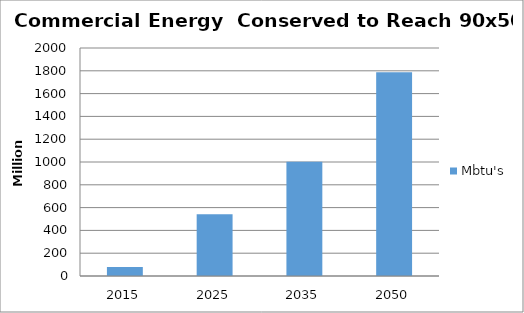
| Category | Mbtu's |
|---|---|
| 2015.0 | 78.353 |
| 2025.0 | 540.639 |
| 2035.0 | 1002.925 |
| 2050.0 | 1786.459 |